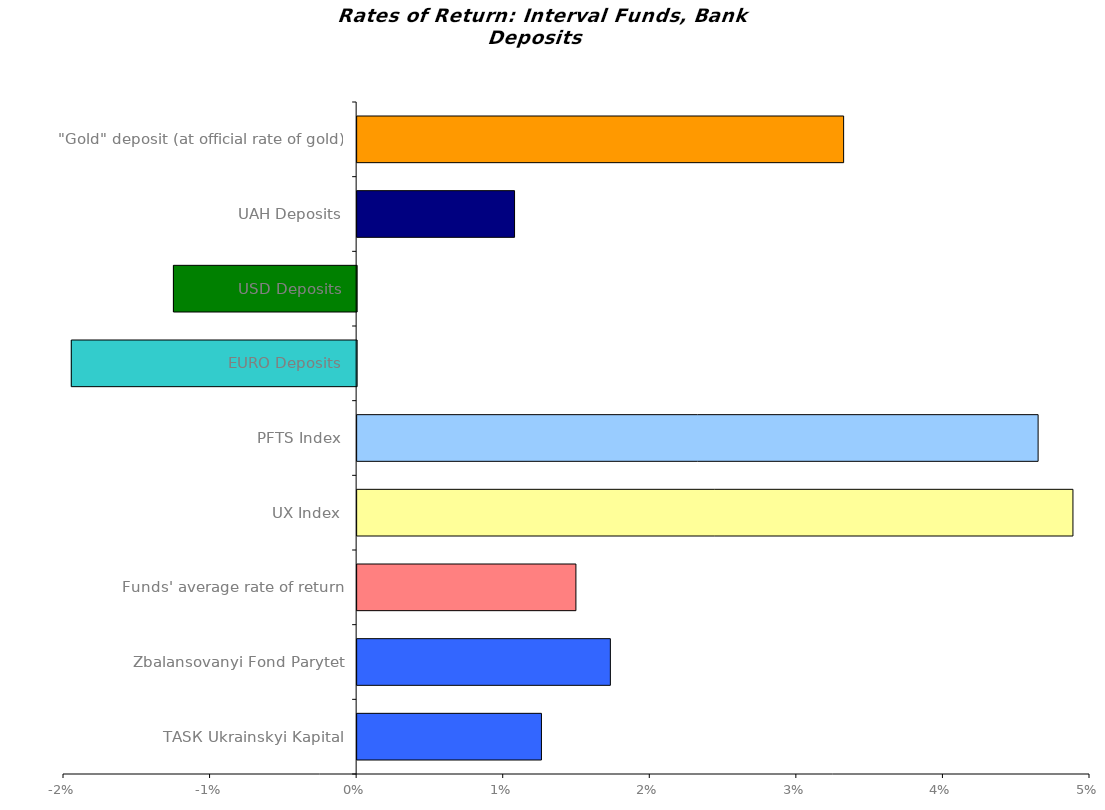
| Category | Series 0 |
|---|---|
| ТАSК Ukrainskyi Kapital | 0.013 |
| Zbalansovanyi Fond Parytet | 0.017 |
| Funds' average rate of return | 0.015 |
| UX Index | 0.049 |
| PFTS Index | 0.046 |
| EURO Deposits | -0.019 |
| USD Deposits | -0.013 |
| UAH Deposits | 0.011 |
| "Gold" deposit (at official rate of gold) | 0.033 |